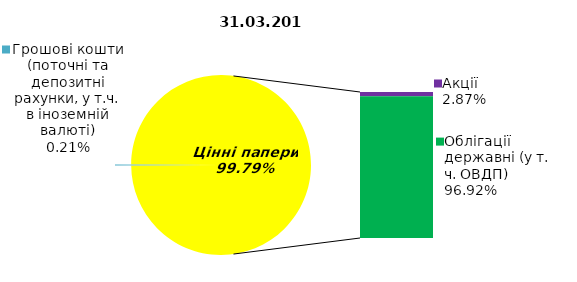
| Category | Series 0 |
|---|---|
| Грошові кошти (поточні та депозитні рахунки, у т.ч. в іноземній валюті) | 0.19 |
| Банківські метали | 0 |
| Нерухомість | 0 |
| Інші активи | 0 |
| Акції | 2.58 |
| Облігації підприємств | 0 |
| Муніципальні облігації | 0 |
| Облігації державні (у т. ч. ОВДП) | 87.05 |
| Іпотечні сертифікати | 0 |